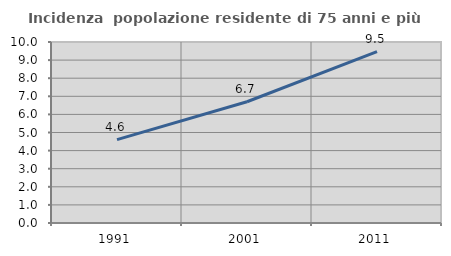
| Category | Incidenza  popolazione residente di 75 anni e più |
|---|---|
| 1991.0 | 4.605 |
| 2001.0 | 6.699 |
| 2011.0 | 9.471 |